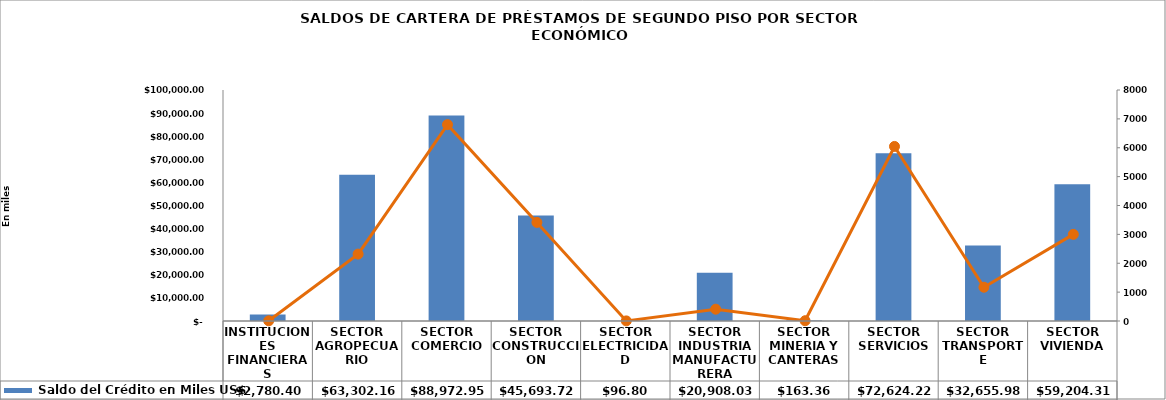
| Category |  Saldo del Crédito en Miles US$ |
|---|---|
| INSTITUCIONES FINANCIERAS | 2780.405 |
| SECTOR AGROPECUARIO | 63302.156 |
| SECTOR COMERCIO | 88972.945 |
| SECTOR CONSTRUCCION | 45693.723 |
| SECTOR ELECTRICIDAD | 96.803 |
| SECTOR INDUSTRIA MANUFACTURERA | 20908.032 |
| SECTOR MINERIA Y CANTERAS | 163.356 |
| SECTOR SERVICIOS | 72624.217 |
| SECTOR TRANSPORTE | 32655.98 |
| SECTOR VIVIENDA | 59204.307 |